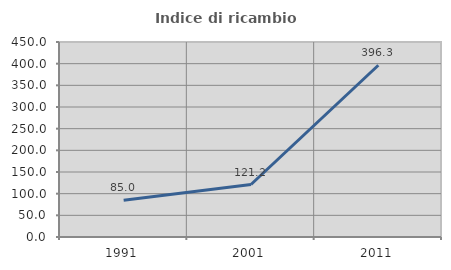
| Category | Indice di ricambio occupazionale  |
|---|---|
| 1991.0 | 85 |
| 2001.0 | 121.154 |
| 2011.0 | 396.296 |